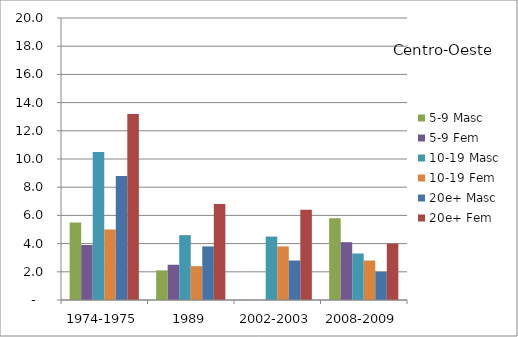
| Category | 5-9 Masc | 5-9 Fem | 10-19 Masc | 10-19 Fem | 20e+ Masc | 20e+ Fem |
|---|---|---|---|---|---|---|
| 1974-1975 | 5.5 | 3.9 | 10.5 | 5 | 8.8 | 13.2 |
| 1989 | 2.1 | 2.5 | 4.6 | 2.4 | 3.8 | 6.8 |
| 2002-2003 | 0 | 0 | 4.5 | 3.8 | 2.8 | 6.4 |
| 2008-2009 | 5.8 | 4.1 | 3.3 | 2.8 | 2 | 4 |